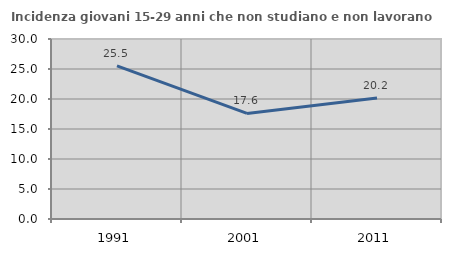
| Category | Incidenza giovani 15-29 anni che non studiano e non lavorano  |
|---|---|
| 1991.0 | 25.53 |
| 2001.0 | 17.596 |
| 2011.0 | 20.151 |